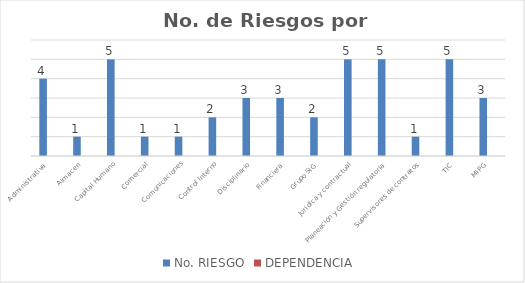
| Category | No. RIESGO | DEPENDENCIA  |
|---|---|---|
| Administrativa  | 4 | 0 |
| Almacen | 1 | 0 |
| Capital Humano | 5 | 0 |
| Comercial | 1 | 0 |
| Comunicaciones | 1 | 0 |
| Control Interno | 2 | 0 |
| Disciplinario | 3 | 0 |
| Financiera | 3 | 0 |
| Grupo SIG | 2 | 0 |
| Juridica y contractual | 5 | 0 |
| Planeación y Gestión regulatoria | 5 | 0 |
| Supervisores de contratos | 1 | 0 |
| TIC | 5 | 0 |
| MIPG | 3 | 0 |